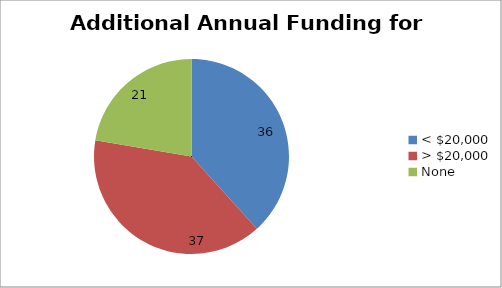
| Category | Series 0 |
|---|---|
| < $20,000 | 36 |
| > $20,000 | 37 |
| None | 21 |